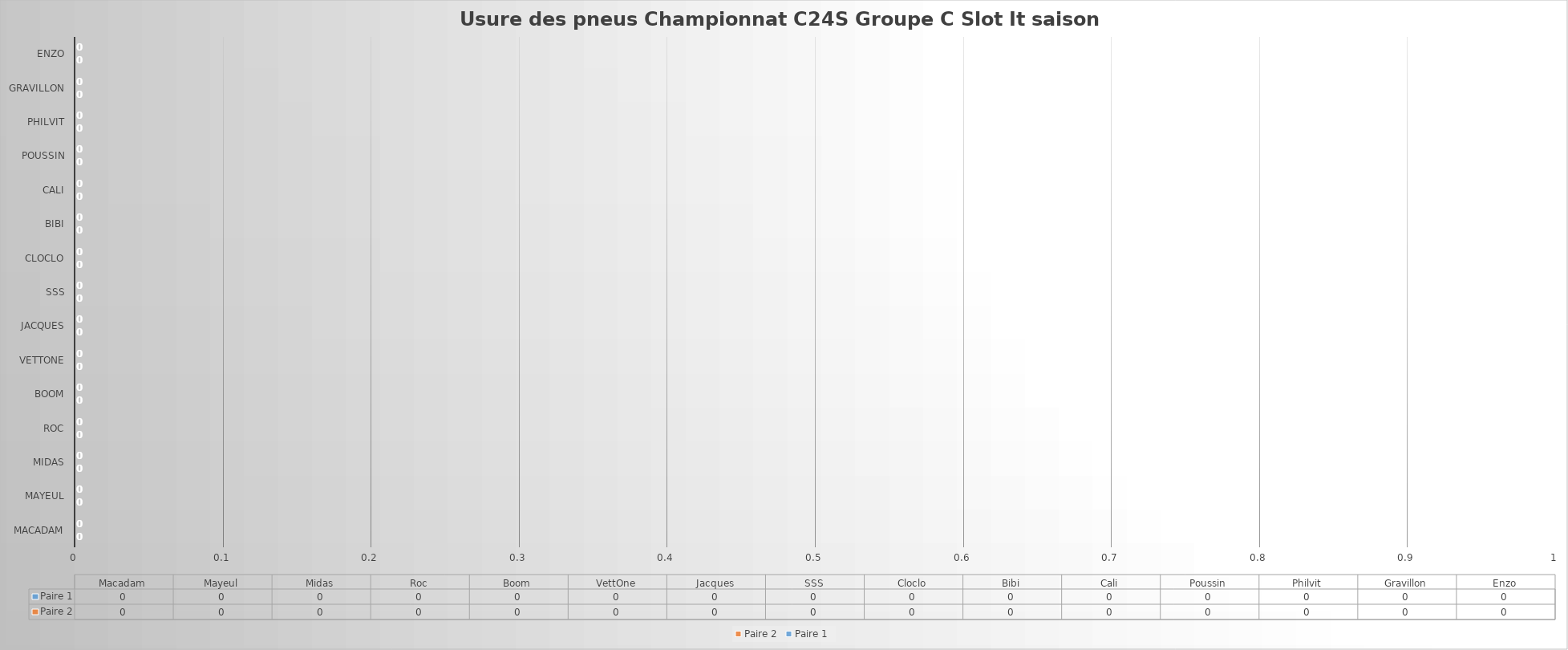
| Category | Paire 2 | Paire 1 |
|---|---|---|
| Macadam | 0 | 0 |
| Mayeul | 0 | 0 |
| Midas | 0 | 0 |
| Roc | 0 | 0 |
| Boom | 0 | 0 |
| VettOne | 0 | 0 |
| Jacques | 0 | 0 |
| SSS | 0 | 0 |
| Cloclo | 0 | 0 |
| Bibi | 0 | 0 |
| Cali | 0 | 0 |
| Poussin | 0 | 0 |
| Philvit | 0 | 0 |
| Gravillon | 0 | 0 |
| Enzo | 0 | 0 |